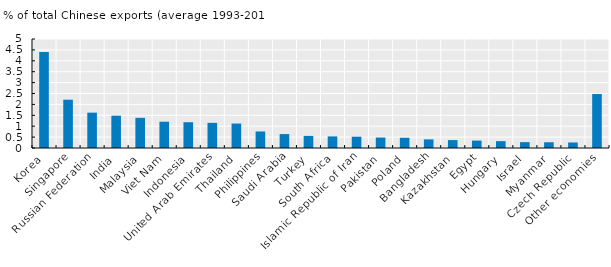
| Category | Average 1993-2017 |
|---|---|
| Korea | 4.409 |
| Singapore | 2.215 |
| Russian Federation | 1.622 |
| India | 1.482 |
| Malaysia | 1.384 |
| Viet Nam | 1.205 |
| Indonesia | 1.183 |
| United Arab Emirates | 1.153 |
| Thailand | 1.122 |
| Philippines | 0.758 |
| Saudi Arabia | 0.639 |
| Turkey | 0.554 |
| South Africa | 0.532 |
| Islamic Republic of Iran | 0.517 |
| Pakistan | 0.479 |
| Poland | 0.469 |
| Bangladesh | 0.395 |
| Kazakhstan | 0.362 |
| Egypt | 0.34 |
| Hungary | 0.315 |
| Israel | 0.268 |
| Myanmar | 0.264 |
| Czech Republic | 0.254 |
| Other economies | 2.475 |